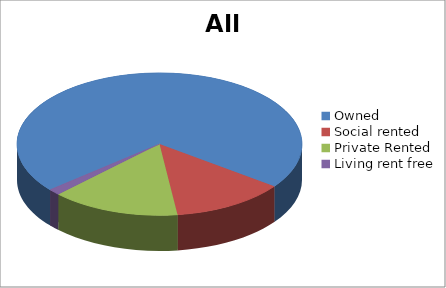
| Category | All |
|---|---|
| Owned | 244051 |
| Social rented | 44144 |
| Private Rented | 49831 |
| Living rent free | 4684 |